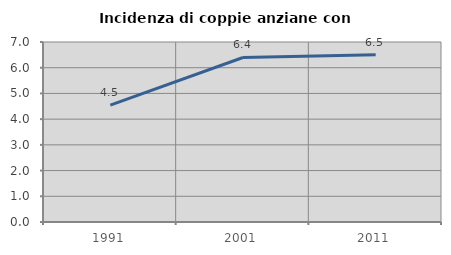
| Category | Incidenza di coppie anziane con figli |
|---|---|
| 1991.0 | 4.545 |
| 2001.0 | 6.397 |
| 2011.0 | 6.507 |